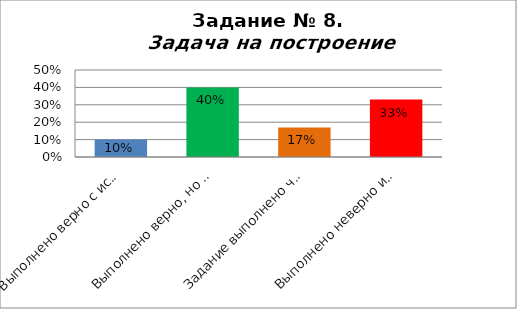
| Category | Задача на построение |
|---|---|
| Выполнено верно с использованием точки пересечения перпендикуляров и проведено обоснование | 0.1 |
| Выполнено верно, но отстуствует обоснование | 0.4 |
| Задание выполнено через построение вершины С | 0.17 |
| Выполнено неверно или к заданию не приступал | 0.33 |